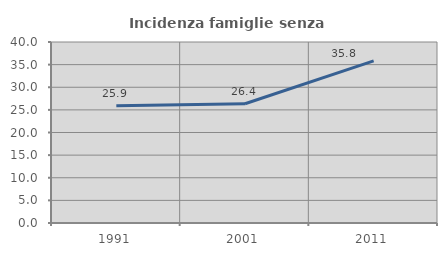
| Category | Incidenza famiglie senza nuclei |
|---|---|
| 1991.0 | 25.907 |
| 2001.0 | 26.36 |
| 2011.0 | 35.836 |